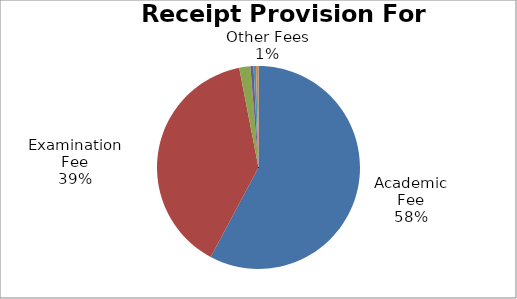
| Category | Budget 2019-20 | Percentage |
|---|---|---|
| Academic Fee | 791920000 | 57.8 |
| Examination Fee | 536370000 | 39.15 |
| Other Receipts | 24290000 | 1.77 |
| Other Fees | 6690000 | 0.49 |
| Study centre Receipts | 5510000 | 0.4 |
| KVK Receipts | 5300000 | 0.39 |